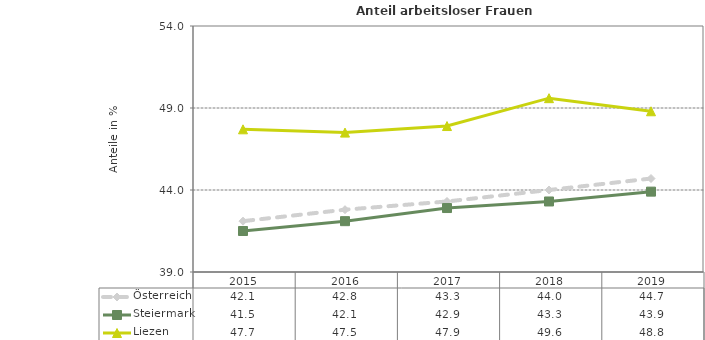
| Category | Österreich | Steiermark | Liezen |
|---|---|---|---|
| 2019.0 | 44.7 | 43.9 | 48.8 |
| 2018.0 | 44 | 43.3 | 49.6 |
| 2017.0 | 43.3 | 42.9 | 47.9 |
| 2016.0 | 42.8 | 42.1 | 47.5 |
| 2015.0 | 42.1 | 41.5 | 47.7 |